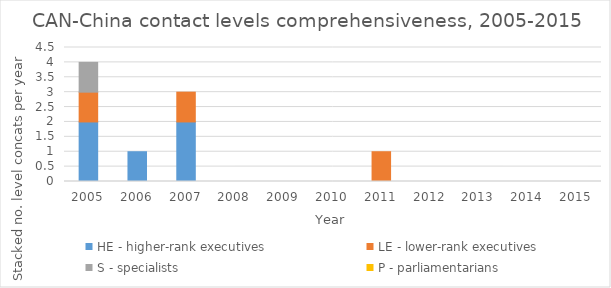
| Category | HE - higher-rank executives | LE - lower-rank executives | S - specialists | P - parliamentarians |
|---|---|---|---|---|
| 2005.0 | 2 | 1 | 1 | 0 |
| 2006.0 | 1 | 0 | 0 | 0 |
| 2007.0 | 2 | 1 | 0 | 0 |
| 2008.0 | 0 | 0 | 0 | 0 |
| 2009.0 | 0 | 0 | 0 | 0 |
| 2010.0 | 0 | 0 | 0 | 0 |
| 2011.0 | 0 | 1 | 0 | 0 |
| 2012.0 | 0 | 0 | 0 | 0 |
| 2013.0 | 0 | 0 | 0 | 0 |
| 2014.0 | 0 | 0 | 0 | 0 |
| 2015.0 | 0 | 0 | 0 | 0 |